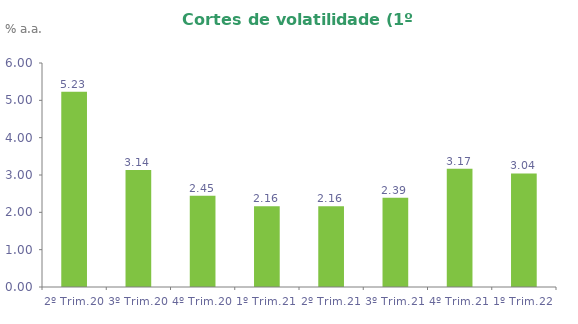
| Category | Series 0 |
|---|---|
| 2º Trim.20 | 5.231 |
| 3º Trim.20 | 3.137 |
| 4º Trim.20 | 2.447 |
| 1º Trim.21 | 2.162 |
| 2º Trim.21 | 2.162 |
| 3º Trim.21 | 2.387 |
| 4º Trim.21 | 3.166 |
| 1º Trim.22 | 3.042 |